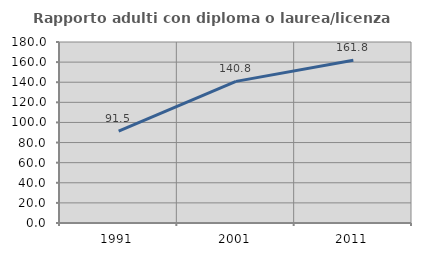
| Category | Rapporto adulti con diploma o laurea/licenza media  |
|---|---|
| 1991.0 | 91.459 |
| 2001.0 | 140.824 |
| 2011.0 | 161.767 |